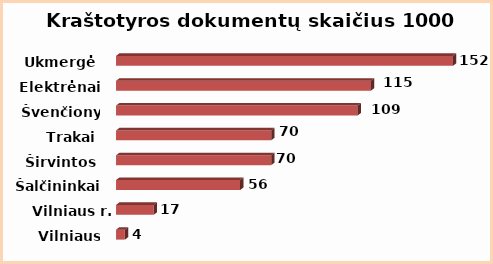
| Category | Series 0 |
|---|---|
| Vilniaus m. | 4 |
| Vilniaus r. | 17 |
| Šalčininkai | 56 |
| Širvintos | 70 |
| Trakai | 70 |
| Švenčionys | 109 |
| Elektrėnai | 115 |
| Ukmergė | 152 |